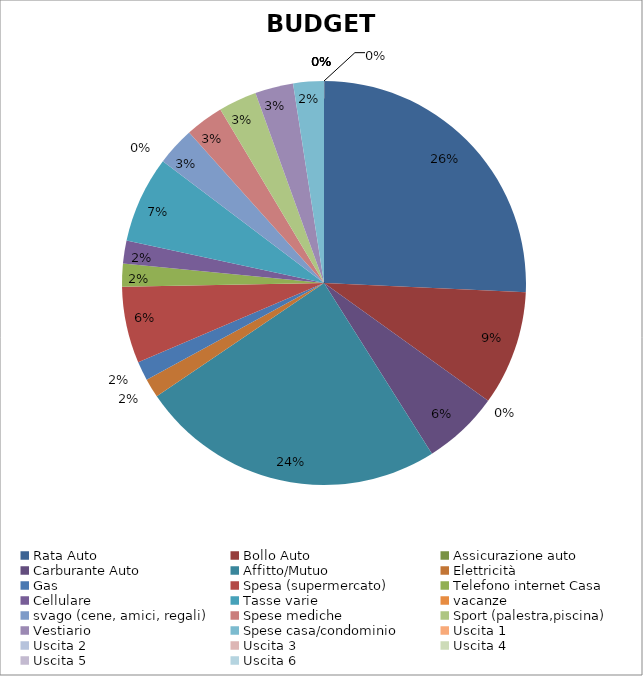
| Category | Budget |
|---|---|
| Rata Auto | 420 |
| Bollo Auto | 150 |
| Assicurazione auto | 0 |
| Carburante Auto | 100 |
| Affitto/Mutuo | 400 |
| Elettricità | 25 |
| Gas | 25 |
| Spesa (supermercato) | 100 |
| Telefono internet Casa | 30 |
| Cellulare | 30 |
| Tasse varie | 113 |
| vacanze | 0 |
| svago (cene, amici, regali) | 50 |
| Spese mediche | 50 |
| Sport (palestra,piscina) | 50 |
| Vestiario | 50 |
| Spese casa/condominio | 40 |
| Uscita 1 | 0 |
| Uscita 2 | 0 |
| Uscita 3 | 0 |
| Uscita 4 | 0 |
| Uscita 5 | 0 |
| Uscita 6 | 0 |